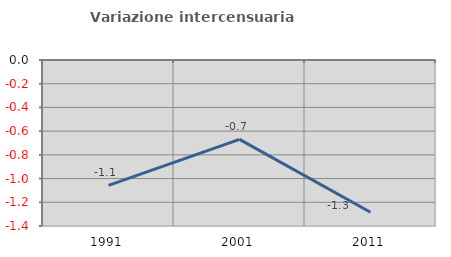
| Category | Variazione intercensuaria annua |
|---|---|
| 1991.0 | -1.057 |
| 2001.0 | -0.669 |
| 2011.0 | -1.284 |